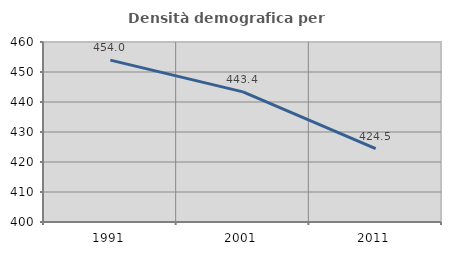
| Category | Densità demografica |
|---|---|
| 1991.0 | 453.961 |
| 2001.0 | 443.365 |
| 2011.0 | 424.483 |